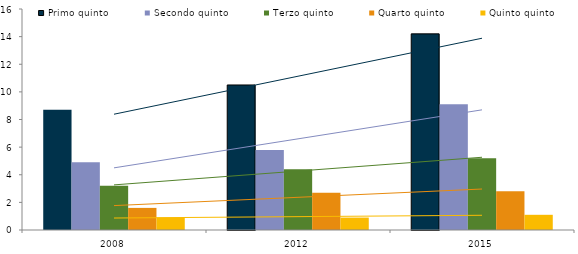
| Category | Primo quinto | Secondo quinto | Terzo quinto | Quarto quinto | Quinto quinto |
|---|---|---|---|---|---|
| 2008 | 8.7 | 4.9 | 3.2 | 1.6 | 0.9 |
| 2012 | 10.5 | 5.8 | 4.4 | 2.7 | 0.9 |
| 2015 | 14.2 | 9.1 | 5.2 | 2.8 | 1.1 |